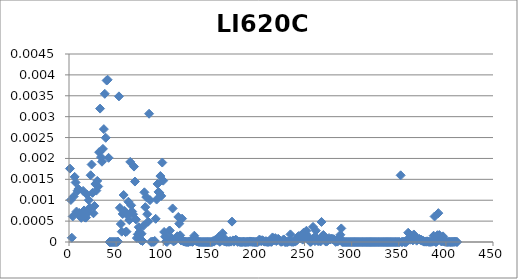
| Category |  LI620C |
|---|---|
| 0 | 0.002 |
| 1 | 0.001 |
| 2 | 0 |
| 3 | 0.001 |
| 4 | 0.001 |
| 5 | 0.002 |
| 6 | 0.001 |
| 7 | 0.001 |
| 8 | 0.001 |
| 9 | 0.001 |
| 10 | 0.001 |
| 11 | 0.001 |
| 12 | 0.001 |
| 13 | 0.001 |
| 14 | 0.001 |
| 15 | 0.001 |
| 16 | 0.001 |
| 17 | 0.001 |
| 18 | 0.001 |
| 19 | 0.001 |
| 20 | 0.001 |
| 21 | 0.001 |
| 22 | 0.002 |
| 23 | 0.002 |
| 24 | 0.001 |
| 25 | 0.001 |
| 26 | 0.001 |
| 27 | 0.001 |
| 28 | 0.001 |
| 29 | 0.001 |
| 30 | 0.001 |
| 31 | 0.002 |
| 32 | 0.003 |
| 33 | 0.002 |
| 34 | 0.002 |
| 35 | 0.002 |
| 36 | 0.003 |
| 37 | 0.004 |
| 38 | 0.002 |
| 39 | 0.004 |
| 40 | 0.004 |
| 41 | 0.002 |
| 42 | 0 |
| 43 | 0 |
| 44 | 0 |
| 45 | 0 |
| 46 | 0 |
| 47 | 0 |
| 48 | 0 |
| 49 | 0 |
| 50 | 0 |
| 51 | 0 |
| 52 | 0.003 |
| 53 | 0.001 |
| 54 | 0 |
| 55 | 0 |
| 56 | 0.001 |
| 57 | 0.001 |
| 58 | 0.001 |
| 59 | 0 |
| 60 | 0 |
| 61 | 0.001 |
| 62 | 0.001 |
| 63 | 0.001 |
| 64 | 0.002 |
| 65 | 0.001 |
| 66 | 0.001 |
| 67 | 0.001 |
| 68 | 0.002 |
| 69 | 0.001 |
| 70 | 0.001 |
| 71 | 0 |
| 72 | 0 |
| 73 | 0 |
| 74 | 0 |
| 75 | 0 |
| 76 | 0 |
| 77 | 0 |
| 78 | 0 |
| 79 | 0.001 |
| 80 | 0.001 |
| 81 | 0.001 |
| 82 | 0.001 |
| 83 | 0 |
| 84 | 0.003 |
| 85 | 0.001 |
| 86 | 0 |
| 87 | 0 |
| 88 | 0 |
| 89 | 0 |
| 90 | 0 |
| 91 | 0.001 |
| 92 | 0.001 |
| 93 | 0.001 |
| 94 | 0.001 |
| 95 | 0.001 |
| 96 | 0.002 |
| 97 | 0.001 |
| 98 | 0.002 |
| 99 | 0.001 |
| 100 | 0 |
| 101 | 0 |
| 102 | 0 |
| 103 | 0 |
| 104 | 0 |
| 105 | 0 |
| 106 | 0 |
| 107 | 0 |
| 108 | 0 |
| 109 | 0.001 |
| 110 | 0 |
| 111 | 0 |
| 112 | 0 |
| 113 | 0 |
| 114 | 0 |
| 115 | 0.001 |
| 116 | 0 |
| 117 | 0 |
| 118 | 0 |
| 119 | 0.001 |
| 120 | 0 |
| 121 | 0 |
| 122 | 0 |
| 123 | 0 |
| 124 | 0 |
| 125 | 0 |
| 126 | 0 |
| 127 | 0 |
| 128 | 0 |
| 129 | 0 |
| 130 | 0 |
| 131 | 0 |
| 132 | 0 |
| 133 | 0 |
| 134 | 0 |
| 135 | 0 |
| 136 | 0 |
| 137 | 0 |
| 138 | 0 |
| 139 | 0 |
| 140 | 0 |
| 141 | 0 |
| 142 | 0 |
| 143 | 0 |
| 144 | 0 |
| 145 | 0 |
| 146 | 0 |
| 147 | 0 |
| 148 | 0 |
| 149 | 0 |
| 150 | 0 |
| 151 | 0 |
| 152 | 0 |
| 153 | 0 |
| 154 | 0 |
| 155 | 0 |
| 156 | 0 |
| 157 | 0 |
| 158 | 0 |
| 159 | 0 |
| 160 | 0 |
| 161 | 0 |
| 162 | 0 |
| 163 | 0 |
| 164 | 0 |
| 165 | 0 |
| 166 | 0 |
| 167 | 0 |
| 168 | 0 |
| 169 | 0 |
| 170 | 0 |
| 171 | 0 |
| 172 | 0 |
| 173 | 0 |
| 174 | 0 |
| 175 | 0 |
| 176 | 0 |
| 177 | 0 |
| 178 | 0 |
| 179 | 0 |
| 180 | 0 |
| 181 | 0 |
| 182 | 0 |
| 183 | 0 |
| 184 | 0 |
| 185 | 0 |
| 186 | 0 |
| 187 | 0 |
| 188 | 0 |
| 189 | 0 |
| 190 | 0 |
| 191 | 0 |
| 192 | 0 |
| 193 | 0 |
| 194 | 0 |
| 195 | 0 |
| 196 | 0 |
| 197 | 0 |
| 198 | 0 |
| 199 | 0 |
| 200 | 0 |
| 201 | 0 |
| 202 | 0 |
| 203 | 0 |
| 204 | 0 |
| 205 | 0 |
| 206 | 0 |
| 207 | 0 |
| 208 | 0 |
| 209 | 0 |
| 210 | 0 |
| 211 | 0 |
| 212 | 0 |
| 213 | 0 |
| 214 | 0 |
| 215 | 0 |
| 216 | 0 |
| 217 | 0 |
| 218 | 0 |
| 219 | 0 |
| 220 | 0 |
| 221 | 0 |
| 222 | 0 |
| 223 | 0 |
| 224 | 0 |
| 225 | 0 |
| 226 | 0 |
| 227 | 0 |
| 228 | 0 |
| 229 | 0 |
| 230 | 0 |
| 231 | 0 |
| 232 | 0 |
| 233 | 0 |
| 234 | 0 |
| 235 | 0 |
| 236 | 0 |
| 237 | 0 |
| 238 | 0 |
| 239 | 0 |
| 240 | 0 |
| 241 | 0 |
| 242 | 0 |
| 243 | 0 |
| 244 | 0 |
| 245 | 0 |
| 246 | 0 |
| 247 | 0 |
| 248 | 0 |
| 249 | 0 |
| 250 | 0 |
| 251 | 0 |
| 252 | 0 |
| 253 | 0 |
| 254 | 0 |
| 255 | 0 |
| 256 | 0 |
| 257 | 0 |
| 258 | 0 |
| 259 | 0 |
| 260 | 0 |
| 261 | 0 |
| 262 | 0 |
| 263 | 0 |
| 264 | 0 |
| 265 | 0 |
| 266 | 0 |
| 267 | 0 |
| 268 | 0 |
| 269 | 0 |
| 270 | 0 |
| 271 | 0 |
| 272 | 0 |
| 273 | 0 |
| 274 | 0 |
| 275 | 0 |
| 276 | 0 |
| 277 | 0 |
| 278 | 0 |
| 279 | 0 |
| 280 | 0 |
| 281 | 0 |
| 282 | 0 |
| 283 | 0 |
| 284 | 0 |
| 285 | 0 |
| 286 | 0 |
| 287 | 0 |
| 288 | 0 |
| 289 | 0 |
| 290 | 0 |
| 291 | 0 |
| 292 | 0 |
| 293 | 0 |
| 294 | 0 |
| 295 | 0 |
| 296 | 0 |
| 297 | 0 |
| 298 | 0 |
| 299 | 0 |
| 300 | 0 |
| 301 | 0 |
| 302 | 0 |
| 303 | 0 |
| 304 | 0 |
| 305 | 0 |
| 306 | 0 |
| 307 | 0 |
| 308 | 0 |
| 309 | 0 |
| 310 | 0 |
| 311 | 0 |
| 312 | 0 |
| 313 | 0 |
| 314 | 0 |
| 315 | 0 |
| 316 | 0 |
| 317 | 0 |
| 318 | 0 |
| 319 | 0 |
| 320 | 0 |
| 321 | 0 |
| 322 | 0 |
| 323 | 0 |
| 324 | 0 |
| 325 | 0 |
| 326 | 0 |
| 327 | 0 |
| 328 | 0 |
| 329 | 0 |
| 330 | 0 |
| 331 | 0 |
| 332 | 0 |
| 333 | 0 |
| 334 | 0 |
| 335 | 0 |
| 336 | 0 |
| 337 | 0 |
| 338 | 0 |
| 339 | 0 |
| 340 | 0 |
| 341 | 0 |
| 342 | 0 |
| 343 | 0 |
| 344 | 0 |
| 345 | 0 |
| 346 | 0 |
| 347 | 0 |
| 348 | 0 |
| 349 | 0 |
| 350 | 0 |
| 351 | 0.002 |
| 352 | 0 |
| 353 | 0 |
| 354 | 0 |
| 355 | 0 |
| 356 | 0 |
| 357 | 0 |
| 358 | 0 |
| 359 | 0 |
| 360 | 0 |
| 361 | 0 |
| 362 | 0 |
| 363 | 0 |
| 364 | 0 |
| 365 | 0 |
| 366 | 0 |
| 367 | 0 |
| 368 | 0 |
| 369 | 0 |
| 370 | 0 |
| 371 | 0 |
| 372 | 0 |
| 373 | 0 |
| 374 | 0 |
| 375 | 0 |
| 376 | 0 |
| 377 | 0 |
| 378 | 0 |
| 379 | 0 |
| 380 | 0 |
| 381 | 0 |
| 382 | 0 |
| 383 | 0 |
| 384 | 0 |
| 385 | 0 |
| 386 | 0 |
| 387 | 0.001 |
| 388 | 0 |
| 389 | 0 |
| 390 | 0 |
| 391 | 0.001 |
| 392 | 0 |
| 393 | 0 |
| 394 | 0 |
| 395 | 0 |
| 396 | 0 |
| 397 | 0 |
| 398 | 0 |
| 399 | 0 |
| 400 | 0 |
| 401 | 0 |
| 402 | 0 |
| 403 | 0 |
| 404 | 0 |
| 405 | 0 |
| 406 | 0 |
| 407 | 0 |
| 408 | 0 |
| 409 | 0 |
| 410 | 0 |
| 411 | 0 |